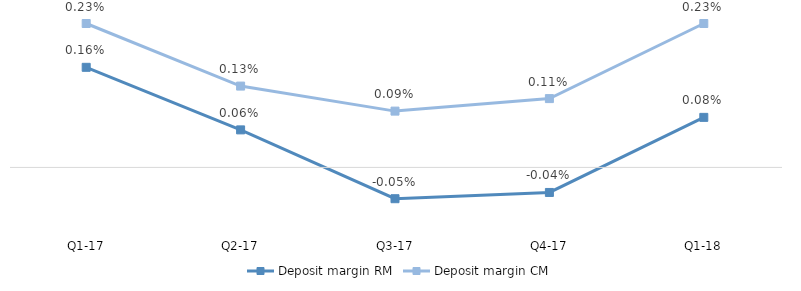
| Category | Deposit margin RM | Deposit margin CM |
|---|---|---|
| Q1-18 | 0.001 | 0.002 |
| Q4-17 | 0 | 0.001 |
| Q3-17 | 0 | 0.001 |
| Q2-17 | 0.001 | 0.001 |
| Q1-17 | 0.002 | 0.002 |